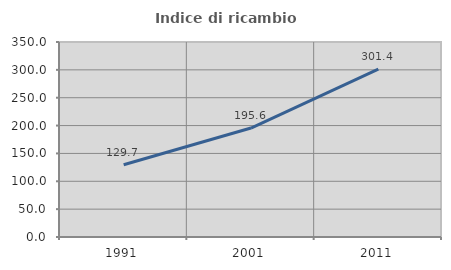
| Category | Indice di ricambio occupazionale  |
|---|---|
| 1991.0 | 129.73 |
| 2001.0 | 195.604 |
| 2011.0 | 301.429 |